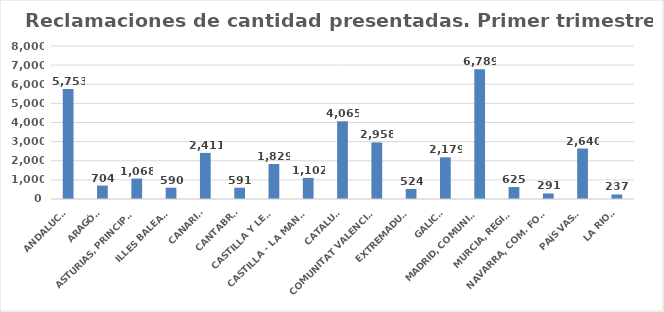
| Category | 616 |
|---|---|
| ANDALUCÍA | 5753 |
| ARAGÓN | 704 |
| ASTURIAS, PRINCIPADO | 1068 |
| ILLES BALEARS | 590 |
| CANARIAS | 2411 |
| CANTABRIA | 591 |
| CASTILLA Y LEÓN | 1829 |
| CASTILLA - LA MANCHA | 1102 |
| CATALUÑA | 4065 |
| COMUNITAT VALENCIANA | 2958 |
| EXTREMADURA | 524 |
| GALICIA | 2179 |
| MADRID, COMUNIDAD | 6789 |
| MURCIA, REGIÓN | 625 |
| NAVARRA, COM. FORAL | 291 |
| PAÍS VASCO | 2640 |
| LA RIOJA | 237 |